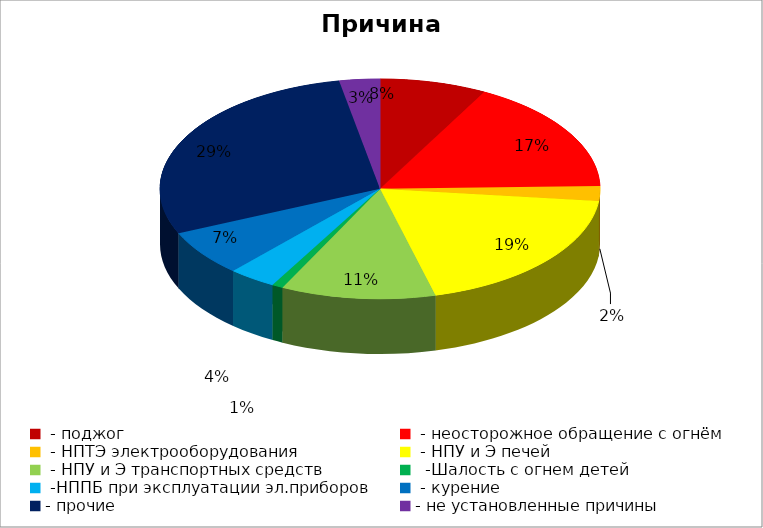
| Category | Причина пожара |
|---|---|
|  - поджог | 29 |
|  - неосторожное обращение с огнём | 62 |
|  - НПТЭ электрооборудования | 8 |
|  - НПУ и Э печей | 71 |
|  - НПУ и Э транспортных средств | 42 |
|   -Шалость с огнем детей | 3 |
|  -НППБ при эксплуатации эл.приборов | 13 |
|  - курение | 25 |
| - прочие | 106 |
| - не установленные причины | 11 |